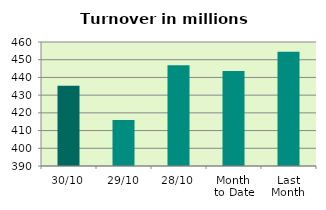
| Category | Series 0 |
|---|---|
| 30/10 | 435.263 |
| 29/10 | 415.913 |
| 28/10 | 446.828 |
| Month 
to Date | 443.568 |
| Last
Month | 454.566 |